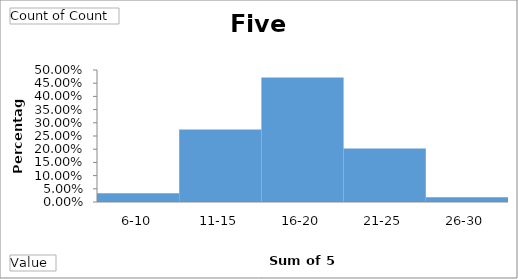
| Category | Total |
|---|---|
| 6-10 | 0.033 |
| 11-15 | 0.275 |
| 16-20 | 0.471 |
| 21-25 | 0.203 |
| 26-30 | 0.018 |